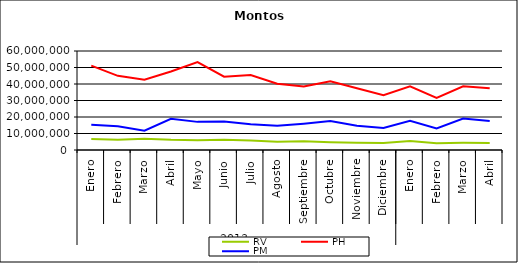
| Category | RV | PH | PM |
|---|---|---|---|
| 0 | 6603412.357 | 51097257.501 | 15291994.497 |
| 1 | 6144371.716 | 44938482.89 | 14418861.164 |
| 2 | 6870539.137 | 42574717.992 | 11735480.075 |
| 3 | 6139858.354 | 47535968.024 | 18924825.739 |
| 4 | 5890476.617 | 53273527.932 | 17047621.863 |
| 5 | 6142686.449 | 44450017.2 | 17254269.094 |
| 6 | 5792277.798 | 45481930.674 | 15546714.502 |
| 7 | 4962192.427 | 40196203.529 | 14644148.591 |
| 8 | 5244267.415 | 38549056.812 | 15946518.356 |
| 9 | 4723321.466 | 41614732.22 | 17536811.707 |
| 10 | 4437368.656 | 37439358.84 | 14761398.421 |
| 11 | 4226608.984 | 33178083.97 | 13384599.022 |
| 12 | 5420667.417 | 38592535.269 | 17738595.757 |
| 13 | 4106438.771 | 31549668.118 | 13082413.394 |
| 14 | 4333641.03 | 38643419.598 | 19107804.717 |
| 15 | 4275572.01 | 37358737.373 | 17555594.298 |